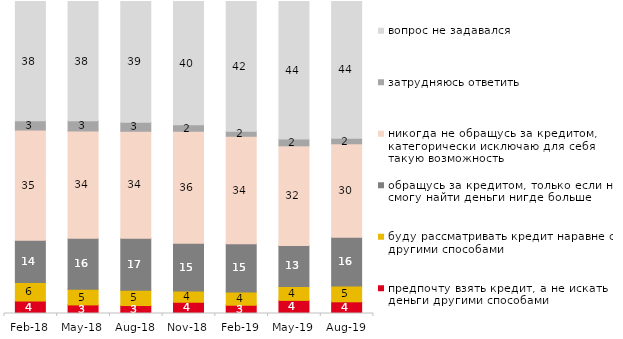
| Category | предпочту взять кредит, а не искать деньги другими способами | буду рассматривать кредит наравне с другими способами | обращусь за кредитом, только если не смогу найти деньги нигде больше | никогда не обращусь за кредитом, категорически исключаю для себя такую возможность | затрудняюсь ответить | вопрос не задавался |
|---|---|---|---|---|---|---|
| 2018-02-01 | 4 | 5.9 | 13.6 | 35.3 | 3 | 38.2 |
| 2018-05-01 | 2.75 | 5.05 | 16.35 | 34.35 | 3.3 | 38.2 |
| 2018-08-01 | 2.55 | 4.9 | 16.7 | 34.25 | 2.9 | 38.7 |
| 2018-11-01 | 3.643 | 3.593 | 15.269 | 35.878 | 2.096 | 39.521 |
| 2019-02-01 | 2.65 | 4.25 | 15.45 | 34.45 | 1.65 | 41.55 |
| 2019-05-01 | 4.21 | 4.458 | 13.125 | 31.947 | 2.229 | 44.032 |
| 2019-08-01 | 3.746 | 5.045 | 15.684 | 29.92 | 1.748 | 43.856 |